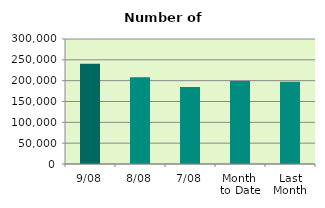
| Category | Series 0 |
|---|---|
| 9/08 | 240834 |
| 8/08 | 208244 |
| 7/08 | 184888 |
| Month 
to Date | 199338.286 |
| Last
Month | 197154.286 |